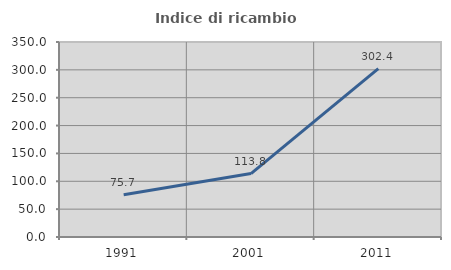
| Category | Indice di ricambio occupazionale  |
|---|---|
| 1991.0 | 75.725 |
| 2001.0 | 113.795 |
| 2011.0 | 302.362 |